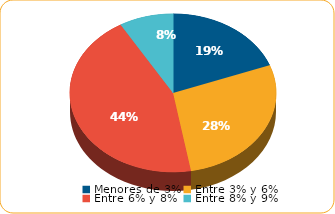
| Category | Series 0 |
|---|---|
| Menores de 3% | 2511.8 |
| Entre 3% y 6% | 3628.4 |
| Entre 6% y 8% | 5762.7 |
| Entre 8% y 9% | 1101.1 |